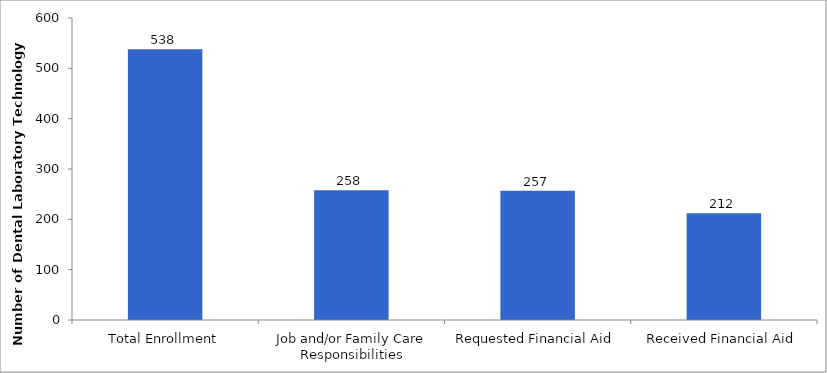
| Category | Series 0 |
|---|---|
| Total Enrollment | 538 |
| Job and/or Family Care Responsibilities | 258 |
| Requested Financial Aid | 257 |
| Received Financial Aid | 212 |